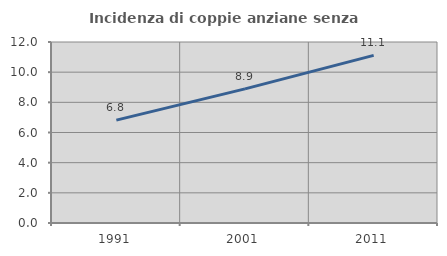
| Category | Incidenza di coppie anziane senza figli  |
|---|---|
| 1991.0 | 6.822 |
| 2001.0 | 8.89 |
| 2011.0 | 11.116 |